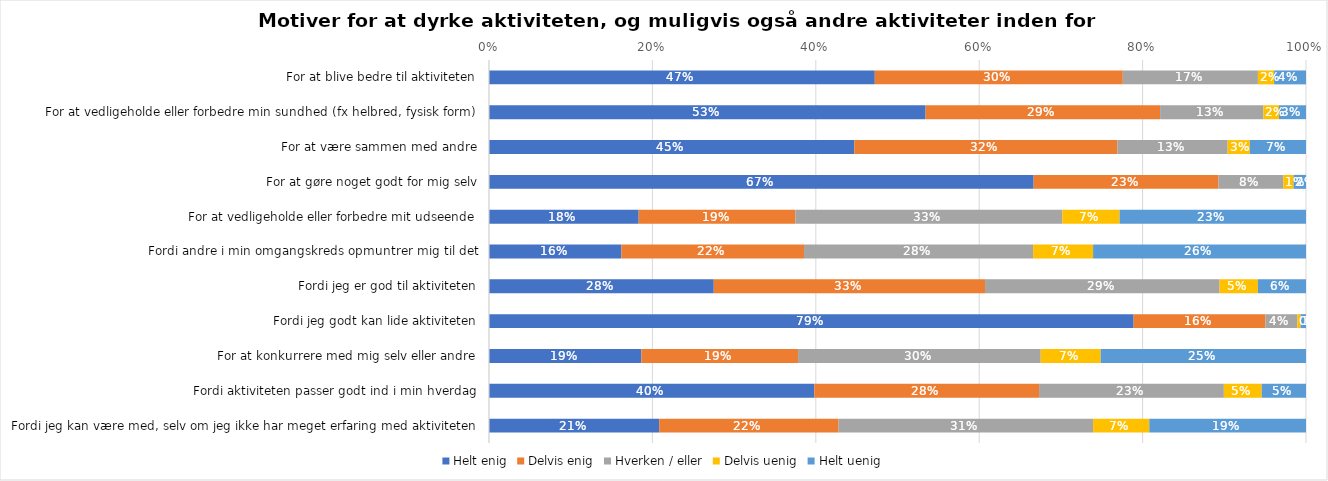
| Category | Helt enig | Delvis enig | Hverken / eller | Delvis uenig | Helt uenig |
|---|---|---|---|---|---|
| For at blive bedre til aktiviteten | 0.472 | 0.304 | 0.165 | 0.02 | 0.039 |
| For at vedligeholde eller forbedre min sundhed (fx helbred, fysisk form) | 0.534 | 0.287 | 0.126 | 0.019 | 0.033 |
| For at være sammen med andre | 0.447 | 0.322 | 0.135 | 0.027 | 0.069 |
| For at gøre noget godt for mig selv | 0.667 | 0.226 | 0.079 | 0.013 | 0.015 |
| For at vedligeholde eller forbedre mit udseende | 0.183 | 0.192 | 0.327 | 0.07 | 0.228 |
| Fordi andre i min omgangskreds opmuntrer mig til det | 0.162 | 0.224 | 0.28 | 0.073 | 0.261 |
| Fordi jeg er god til aktiviteten | 0.275 | 0.332 | 0.287 | 0.047 | 0.059 |
| Fordi jeg godt kan lide aktiviteten | 0.789 | 0.161 | 0.039 | 0.004 | 0.007 |
| For at konkurrere med mig selv eller andre | 0.187 | 0.192 | 0.297 | 0.073 | 0.251 |
| Fordi aktiviteten passer godt ind i min hverdag | 0.398 | 0.275 | 0.226 | 0.046 | 0.054 |
| Fordi jeg kan være med, selv om jeg ikke har meget erfaring med aktiviteten | 0.208 | 0.22 | 0.312 | 0.069 | 0.192 |